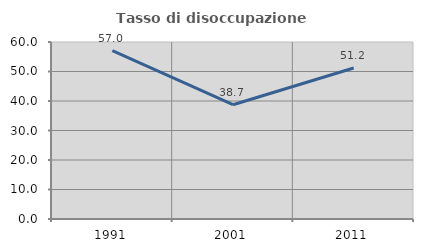
| Category | Tasso di disoccupazione giovanile  |
|---|---|
| 1991.0 | 57.047 |
| 2001.0 | 38.743 |
| 2011.0 | 51.19 |